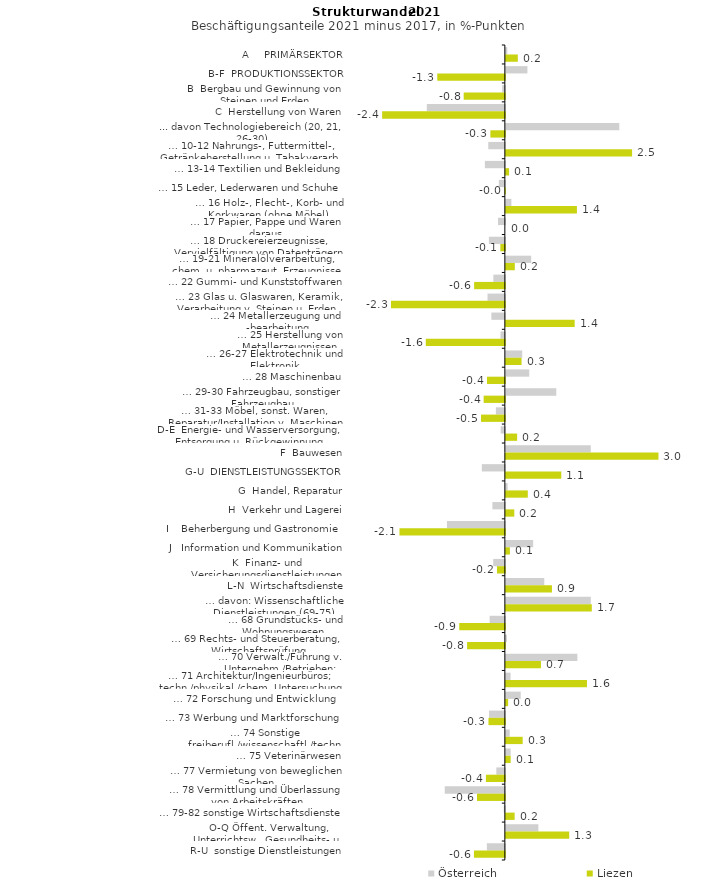
| Category | Österreich | Liezen |
|---|---|---|
| A     PRIMÄRSEKTOR | 0.029 | 0.238 |
| B-F  PRODUKTIONSSEKTOR | 0.429 | -1.344 |
| B  Bergbau und Gewinnung von Steinen und Erden | -0.054 | -0.818 |
| C  Herstellung von Waren | -1.552 | -2.441 |
| ... davon Technologiebereich (20, 21, 26-30) | 2.256 | -0.288 |
| … 10-12 Nahrungs-, Futtermittel-, Getränkeherstellung u. Tabakverarb. | -0.33 | 2.51 |
| … 13-14 Textilien und Bekleidung | -0.397 | 0.064 |
| … 15 Leder, Lederwaren und Schuhe | -0.119 | -0.008 |
| … 16 Holz-, Flecht-, Korb- und Korkwaren (ohne Möbel)  | 0.11 | 1.413 |
| … 17 Papier, Pappe und Waren daraus  | -0.136 | 0 |
| … 18 Druckereierzeugnisse, Vervielfältigung von Datenträgern | -0.317 | -0.089 |
| … 19-21 Mineralölverarbeitung, chem. u. pharmazeut. Erzeugnisse | 0.503 | 0.178 |
| … 22 Gummi- und Kunststoffwaren | -0.229 | -0.611 |
| … 23 Glas u. Glaswaren, Keramik, Verarbeitung v. Steinen u. Erden  | -0.345 | -2.265 |
| … 24 Metallerzeugung und -bearbeitung | -0.269 | 1.369 |
| … 25 Herstellung von Metallerzeugnissen  | -0.086 | -1.572 |
| … 26-27 Elektrotechnik und Elektronik | 0.325 | 0.312 |
| … 28 Maschinenbau | 0.465 | -0.356 |
| … 29-30 Fahrzeugbau, sonstiger Fahrzeugbau | 1.003 | -0.422 |
| … 31-33 Möbel, sonst. Waren, Reparatur/Installation v. Maschinen | -0.178 | -0.475 |
| D-E  Energie- und Wasserversorgung, Entsorgung u. Rückgewinnung | -0.083 | 0.224 |
| F  Bauwesen | 1.689 | 3.035 |
| G-U  DIENSTLEISTUNGSSEKTOR | -0.458 | 1.102 |
| G  Handel, Reparatur | 0.035 | 0.436 |
| H  Verkehr und Lagerei | -0.247 | 0.168 |
| I    Beherbergung und Gastronomie | -1.152 | -2.096 |
| J   Information und Kommunikation | 0.543 | 0.08 |
| K  Finanz- und Versicherungsdienstleistungen | -0.232 | -0.156 |
| L-N  Wirtschaftsdienste | 0.764 | 0.917 |
| … davon: Wissenschaftliche Dienstleistungen (69-75) | 1.689 | 1.709 |
| … 68 Grundstücks- und Wohnungswesen  | -0.302 | -0.907 |
| … 69 Rechts- und Steuerberatung, Wirtschaftsprüfung | 0.021 | -0.751 |
| … 70 Verwalt./Führung v. Unternehm./Betrieben; Unternehmensberat. | 1.422 | 0.698 |
| … 71 Architektur/Ingenieurbüros; techn./physikal./chem. Untersuchung | 0.093 | 1.613 |
| … 72 Forschung und Entwicklung  | 0.296 | 0.046 |
| … 73 Werbung und Marktforschung | -0.315 | -0.326 |
| … 74 Sonstige freiberufl./wissenschaftl./techn. Tätigkeiten | 0.077 | 0.334 |
| … 75 Veterinärwesen | 0.095 | 0.096 |
| … 77 Vermietung von beweglichen Sachen  | -0.17 | -0.377 |
| … 78 Vermittlung und Überlassung von Arbeitskräften | -1.195 | -0.554 |
| … 79-82 sonstige Wirtschaftsdienste | -0.022 | 0.174 |
| O-Q Öffent. Verwaltung, Unterrichtsw., Gesundheits- u. Sozialwesen | 0.646 | 1.26 |
| R-U  sonstige Dienstleistungen | -0.357 | -0.615 |